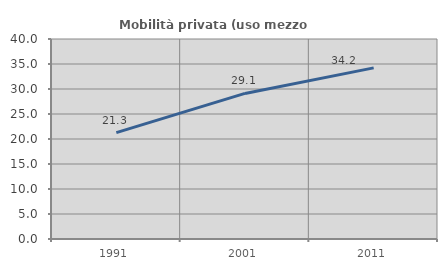
| Category | Mobilità privata (uso mezzo privato) |
|---|---|
| 1991.0 | 21.27 |
| 2001.0 | 29.114 |
| 2011.0 | 34.224 |